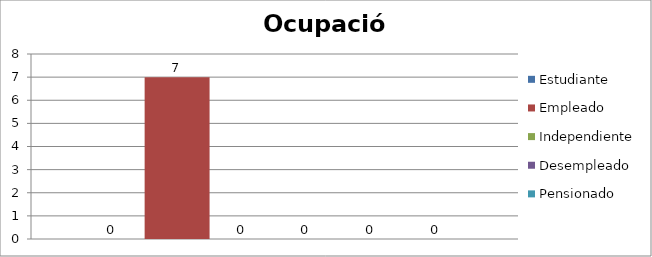
| Category | Estudiante | Empleado | Independiente | Desempleado  | Pensionado | Ama de casa |
|---|---|---|---|---|---|---|
| 0 | 0 | 7 | 0 | 0 | 0 | 0 |